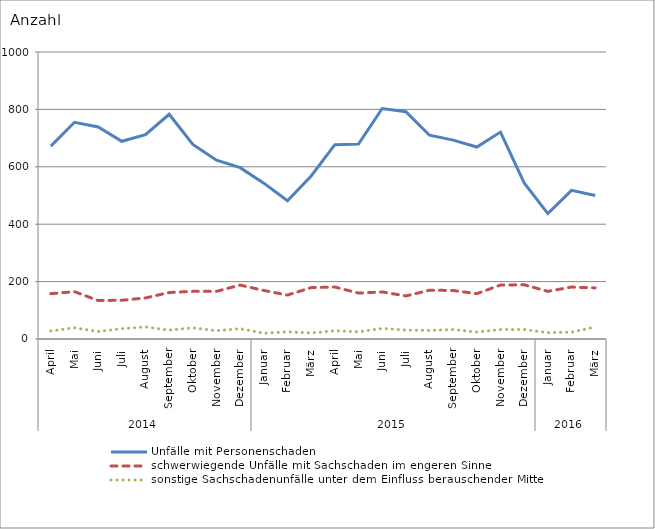
| Category | Unfälle mit Personenschaden | schwerwiegende Unfälle mit Sachschaden im engeren Sinne | sonstige Sachschadenunfälle unter dem Einfluss berauschender Mittel |
|---|---|---|---|
| 0 | 672 | 158 | 28 |
| 1 | 755 | 165 | 39 |
| 2 | 739 | 134 | 26 |
| 3 | 689 | 135 | 36 |
| 4 | 712 | 143 | 42 |
| 5 | 783 | 162 | 31 |
| 6 | 678 | 166 | 39 |
| 7 | 623 | 166 | 29 |
| 8 | 597 | 188 | 36 |
| 9 | 543 | 169 | 20 |
| 10 | 482 | 153 | 25 |
| 11 | 568 | 179 | 21 |
| 12 | 677 | 181 | 29 |
| 13 | 679 | 160 | 25 |
| 14 | 803 | 164 | 37 |
| 15 | 792 | 150 | 31 |
| 16 | 710 | 170 | 30 |
| 17 | 693 | 169 | 33 |
| 18 | 669 | 158 | 24 |
| 19 | 721 | 188 | 33 |
| 20 | 544 | 189 | 33 |
| 21 | 437 | 166 | 22 |
| 22 | 518 | 181 | 24 |
| 23 | 500 | 178 | 42 |